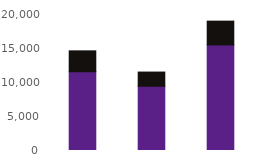
| Category | Online | Telephony |
|---|---|---|
| Nov23 | 11581 | 3073 |
| Dec23 | 9449 | 2086 |
| Jan24 | 15521 | 3504 |